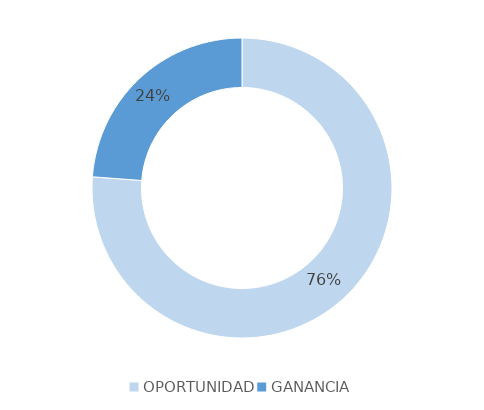
| Category | Series 0 |
|---|---|
| OPORTUNIDAD | 16 |
| GANANCIA | 5 |